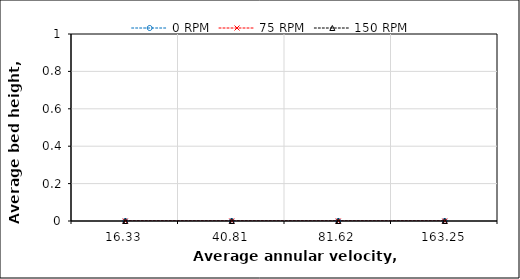
| Category | 0 RPM | 75 RPM | 150 RPM |
|---|---|---|---|
| 16.33 | 0 | 0 | 0 |
| 40.81 | 0 | 0 | 0 |
| 81.62 | 0 | 0 | 0 |
| 163.25 | 0 | 0 | 0 |